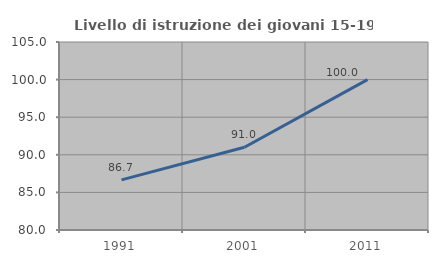
| Category | Livello di istruzione dei giovani 15-19 anni |
|---|---|
| 1991.0 | 86.667 |
| 2001.0 | 91.011 |
| 2011.0 | 100 |